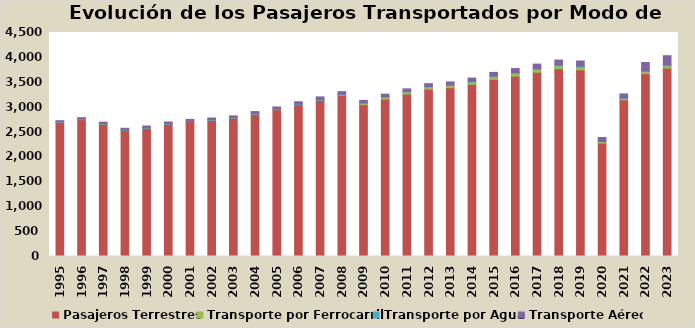
| Category | Pasajeros Terrestres | Transporte por Ferrocarril | Transporte por Agua | Transporte Aéreo |
|---|---|---|---|---|
| 1995.0 | 2691 | 6.678 | 5.098 | 25.192 |
| 1996.0 | 2750 | 6.727 | 6.394 | 26.493 |
| 1997.0 | 2658 | 5.092 | 6.228 | 28.896 |
| 1998.0 | 2536 | 1.576 | 7.179 | 30.922 |
| 1999.0 | 2580 | 0.801 | 7.854 | 32.662 |
| 2000.0 | 2660 | 0.334 | 7.4 | 33.974 |
| 2001.0 | 2713 | 0.242 | 7.507 | 33.673 |
| 2002.0 | 2740 | 0.237 | 8.715 | 33.19 |
| 2003.0 | 2780 | 0.27 | 9.843 | 35.287 |
| 2004.0 | 2860 | 0.253 | 11.744 | 39.422 |
| 2005.0 | 2950 | 0.253 | 11.461 | 42.176 |
| 2006.0 | 3050 | 0.26 | 11.985 | 46.705 |
| 2007.0 | 3141 | 0.288 | 12.761 | 52.217 |
| 2008.0 | 3238 | 8.915 | 12.597 | 53.3 |
| 2009.0 | 3050 | 28 | 10.985 | 46.971 |
| 2010.0 | 3160 | 40.398 | 11.793 | 48.698 |
| 2011.0 | 3264.3 | 41.922 | 10.814 | 50.764 |
| 2012.0 | 3363 | 43.83 | 10.268 | 55.153 |
| 2013.0 | 3391 | 45.288 | 9.969 | 60.007 |
| 2014.0 | 3459 | 47.888 | 11.948 | 65.135 |
| 2015.0 | 3558 | 53.594 | 13.685 | 73.265 |
| 2016.0 | 3623 | 55.766 | 15.272 | 81.286 |
| 2017.0 | 3701 | 56.715 | 17.429 | 89.641 |
| 2018.0 | 3773 | 57.757 | 18.688 | 96.406 |
| 2019.0 | 3749 | 57.511 | 19.929 | 101.389 |
| 2020.0 | 2277 | 29.7 | 7.114 | 78.1 |
| 2021.0 | 3147 | 30.357 | 8.907 | 80.325 |
| 2022.0 | 3674 | 41 | 15.3 | 167.2 |
| 2023.0 | 3785 | 45.7 | 16.2 | 186.6 |